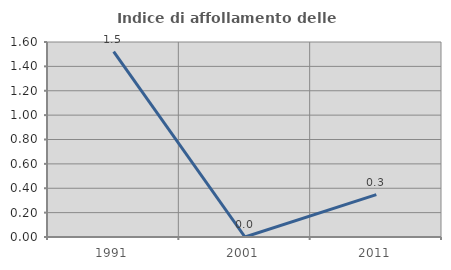
| Category | Indice di affollamento delle abitazioni  |
|---|---|
| 1991.0 | 1.521 |
| 2001.0 | 0 |
| 2011.0 | 0.347 |